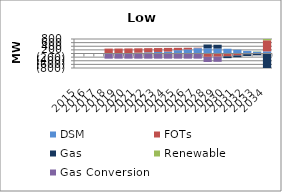
| Category | DSM | FOTs | Gas | Renewable | Gas Conversion |
|---|---|---|---|---|---|
| 2015.0 | 0 | 0 | 0 | 0 | 0 |
| 2016.0 | 0 | 0 | 0 | 0 | 0 |
| 2017.0 | 0 | 0 | 0 | 0 | 0 |
| 2018.0 | 5.31 | 265.828 | 0 | 0 | -285 |
| 2019.0 | 13.71 | 260.278 | 0 | 0 | -285 |
| 2020.0 | 27.4 | 252.052 | 0 | 0 | -285 |
| 2021.0 | 43.42 | 243.007 | 0 | 0 | -285 |
| 2022.0 | 64.75 | 229.829 | 0 | 0 | -285 |
| 2023.0 | 84.97 | 215.705 | 0 | 0 | -285 |
| 2024.0 | 105.22 | 201.586 | 0 | 0 | -285 |
| 2025.0 | 183.51 | 127.124 | 0 | 0 | -285 |
| 2026.0 | 223.42 | 90.663 | 0 | 2.241 | -285 |
| 2027.0 | 294.48 | 24.01 | 0 | 2.241 | -285 |
| 2028.0 | 284.75 | -184.808 | 212 | 2.241 | -285 |
| 2029.0 | 270.34 | -173.938 | 212 | 2.241 | -285 |
| 2030.0 | 260.98 | -155.614 | -101.4 | 2.241 | 0 |
| 2031.0 | 208.93 | -103.93 | -101.4 | 2.241 | 0 |
| 2032.0 | 140.54 | -35.269 | -101.4 | 2.241 | 0 |
| 2033.0 | 98.06 | 0 | -101.4 | 18.092 | 0 |
| 2034.0 | 117.03 | 612.061 | -812.837 | 91.193 | 0 |